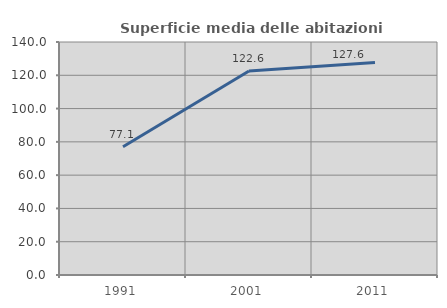
| Category | Superficie media delle abitazioni occupate |
|---|---|
| 1991.0 | 77.107 |
| 2001.0 | 122.589 |
| 2011.0 | 127.617 |